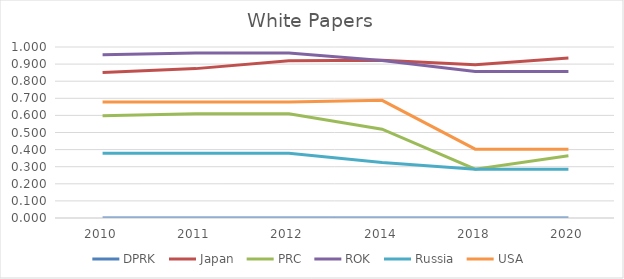
| Category | DPRK  | Japan  | PRC  | ROK  | Russia  | USA  |
|---|---|---|---|---|---|---|
| 2010.0 | 0 | 0.851 | 0.598 | 0.954 | 0.379 | 0.678 |
| 2011.0 | 0 | 0.874 | 0.609 | 0.966 | 0.379 | 0.678 |
| 2012.0 | 0 | 0.92 | 0.609 | 0.966 | 0.379 | 0.678 |
| 2014.0 | 0 | 0.922 | 0.519 | 0.921 | 0.325 | 0.688 |
| 2018.0 | 0 | 0.896 | 0.286 | 0.857 | 0.286 | 0.403 |
| 2020.0 | 0 | 0.935 | 0.364 | 0.857 | 0.286 | 0.403 |